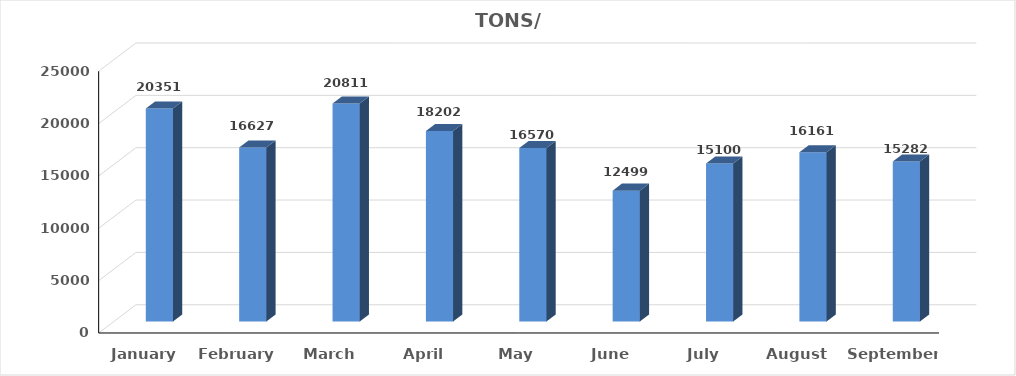
| Category | TONS |
|---|---|
| January | 20351 |
| February | 16627 |
| March | 20811 |
| April | 18202 |
| May | 16570 |
| June | 12499 |
| July | 15100 |
| August | 16161 |
| September | 15282 |